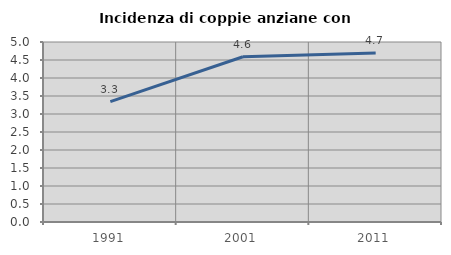
| Category | Incidenza di coppie anziane con figli |
|---|---|
| 1991.0 | 3.345 |
| 2001.0 | 4.591 |
| 2011.0 | 4.694 |